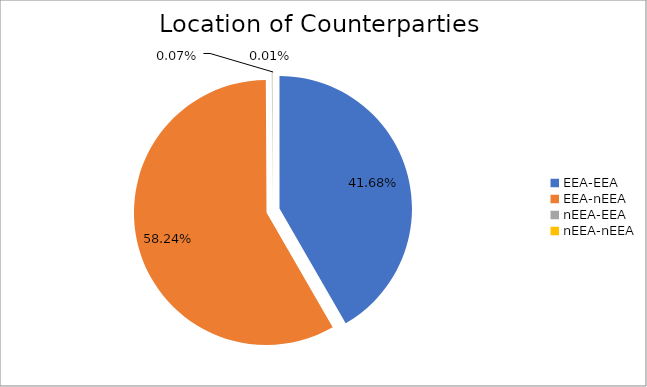
| Category | Series 0 |
|---|---|
| EEA-EEA | 4974940.303 |
| EEA-nEEA | 6952265.16 |
| nEEA-EEA | 8385.15 |
| nEEA-nEEA | 1470.87 |